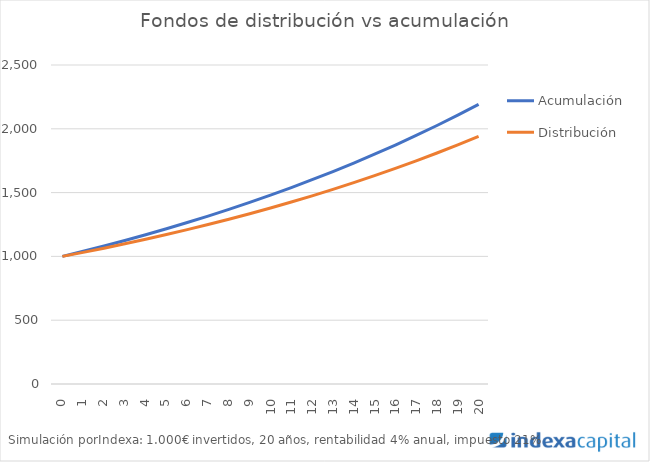
| Category | Acumulación | Distribución |
|---|---|---|
| 0.0 | 1000 | 1000 |
| 1.0 | 1040 | 1031.6 |
| 2.0 | 1081.6 | 1064.464 |
| 3.0 | 1124.864 | 1098.643 |
| 4.0 | 1169.859 | 1134.188 |
| 5.0 | 1216.653 | 1171.156 |
| 6.0 | 1265.319 | 1209.602 |
| 7.0 | 1315.932 | 1249.586 |
| 8.0 | 1368.569 | 1291.17 |
| 9.0 | 1423.312 | 1334.416 |
| 10.0 | 1480.244 | 1379.393 |
| 11.0 | 1539.454 | 1426.169 |
| 12.0 | 1601.032 | 1474.815 |
| 13.0 | 1665.074 | 1525.408 |
| 14.0 | 1731.676 | 1578.024 |
| 15.0 | 1800.944 | 1632.745 |
| 16.0 | 1872.981 | 1689.655 |
| 17.0 | 1947.9 | 1748.841 |
| 18.0 | 2025.817 | 1810.395 |
| 19.0 | 2106.849 | 1874.411 |
| 20.0 | 2191.123 | 1940.987 |